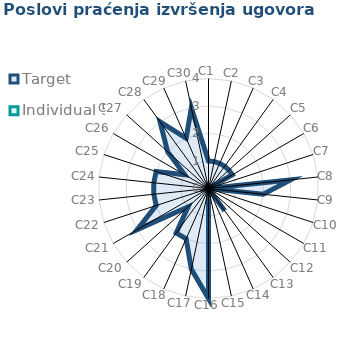
| Category | Target | Individual 5 |
|---|---|---|
| C1 | 1 | 0 |
| C2 | 1 | 0 |
| C3 | 1 | 0 |
| C4 | 1 | 0 |
| C5 | 1 | 0 |
| C6 | 1 | 0 |
| C7 | 0 | 0 |
| C8 | 3 | 0 |
| C9 | 2 | 0 |
| C10 | 0 | 0 |
| C11 | 0 | 0 |
| C12 | 0 | 0 |
| C13 | 1 | 0 |
| C14 | 0 | 0 |
| C15 | 0 | 0 |
| C16 | 4 | 0 |
| C17 | 3 | 0 |
| C18 | 2 | 0 |
| C19 | 2 | 0 |
| C20 | 1 | 0 |
| C21 | 3 | 0 |
| C22 | 2 | 0 |
| C23 | 2 | 0 |
| C24 | 2 | 0 |
| C25 | 2 | 0 |
| C26 | 1 | 0 |
| C27 | 2 | 0 |
| C28 | 3 | 0 |
| C29 | 2 | 0 |
| C30 | 3 | 0 |